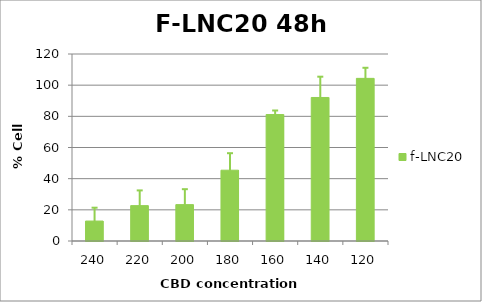
| Category | f-LNC20 |
|---|---|
| 240.0 | 12.8 |
| 220.0 | 22.695 |
| 200.0 | 23.339 |
| 180.0 | 45.435 |
| 160.0 | 81.14 |
| 140.0 | 92.096 |
| 120.0 | 104.366 |